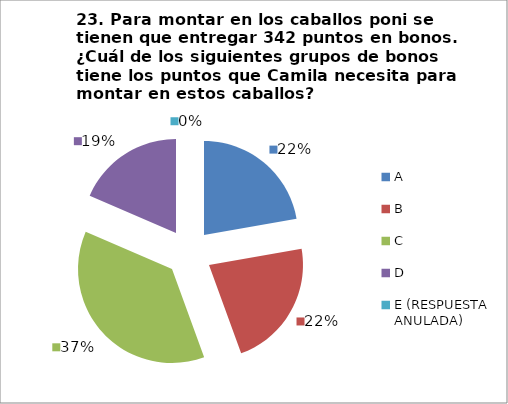
| Category | CANTIDAD DE RESPUESTAS PREGUNTA (23) | PORCENTAJE |
|---|---|---|
| A | 6 | 0.222 |
| B | 6 | 0.222 |
| C | 10 | 0.37 |
| D | 5 | 0.185 |
| E (RESPUESTA ANULADA) | 0 | 0 |